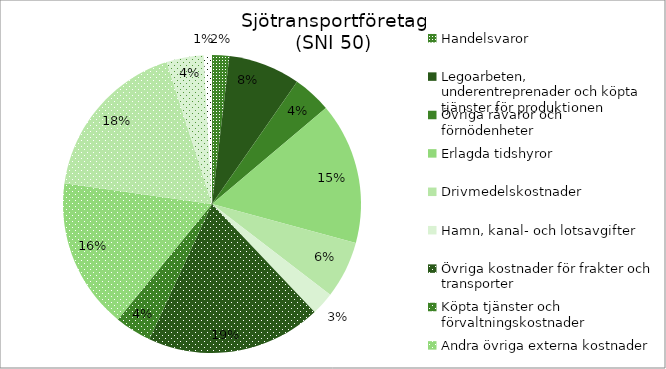
| Category | Series 0 |
|---|---|
| Handelsvaror | 681.049 |
| Legoarbeten, underentreprenader och köpta tjänster för produktionen | 2847.631 |
| Övriga råvaror och förnödenheter | 1523.727 |
| Erlagda tidshyror | 5604.896 |
| Drivmedelskostnader | 2264.271 |
| Hamn, kanal- och lotsavgifter | 911.612 |
| Övriga kostnader för frakter och transporter | 6931.041 |
| Köpta tjänster och förvaltningskostnader | 1451.429 |
| Andra övriga externa kostnader | 5959.651 |
| Personalkostnader | 6514.675 |
| Avskrivningar | 1474.117 |
| Övriga rörelsekostnader | 320.977 |